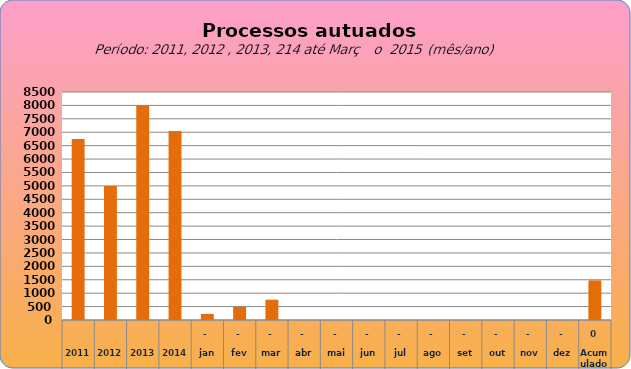
| Category | 6749 4998 8003 7049  228   488   758   -     -     -     -     -     -     -     -     -     1.474  |
|---|---|
| 2011 | 6749 |
| 2012 | 4998 |
| 2013 | 8003 |
| 2014 | 7049 |
| jan | 228 |
| fev | 491 |
| mar | 758 |
| abr | 0 |
| mai | 0 |
| jun | 0 |
| jul | 0 |
| ago | 0 |
| set | 0 |
| out | 0 |
| nov | 0 |
| dez | 0 |
| Acumulado
 | 1477 |